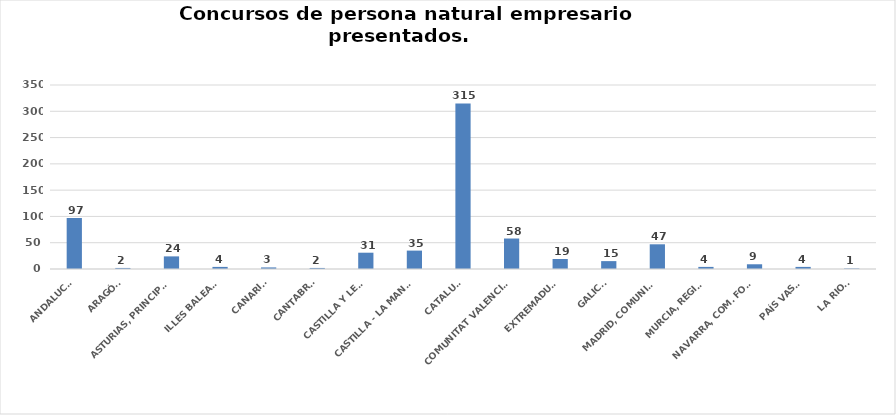
| Category | Series 0 |
|---|---|
| ANDALUCÍA | 97 |
| ARAGÓN | 2 |
| ASTURIAS, PRINCIPADO | 24 |
| ILLES BALEARS | 4 |
| CANARIAS | 3 |
| CANTABRIA | 2 |
| CASTILLA Y LEÓN | 31 |
| CASTILLA - LA MANCHA | 35 |
| CATALUÑA | 315 |
| COMUNITAT VALENCIANA | 58 |
| EXTREMADURA | 19 |
| GALICIA | 15 |
| MADRID, COMUNIDAD | 47 |
| MURCIA, REGIÓN | 4 |
| NAVARRA, COM. FORAL | 9 |
| PAÍS VASCO | 4 |
| LA RIOJA | 1 |